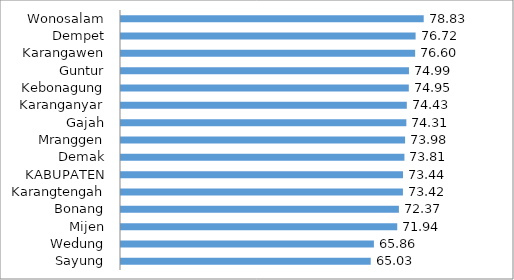
| Category | Series 0 |
|---|---|
| Sayung | 65.03 |
| Wedung | 65.86 |
| Mijen | 71.94 |
| Bonang | 72.37 |
| Karangtengah | 73.42 |
| KABUPATEN | 73.44 |
| Demak | 73.81 |
| Mranggen | 73.98 |
| Gajah | 74.31 |
| Karanganyar | 74.43 |
| Kebonagung | 74.95 |
| Guntur | 74.99 |
| Karangawen | 76.6 |
| Dempet | 76.72 |
| Wonosalam | 78.83 |